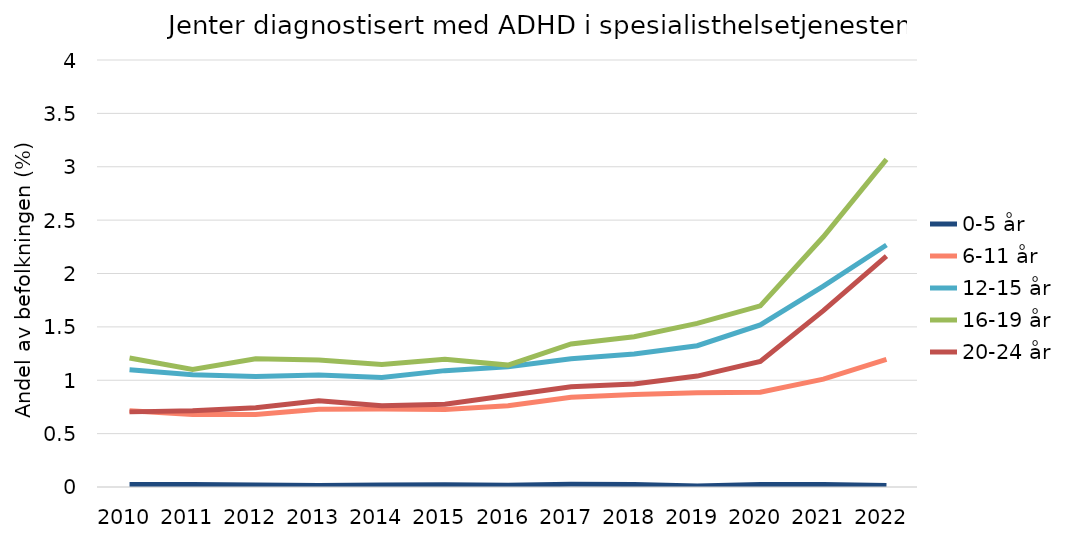
| Category | 0-5 år | 6-11 år | 12-15 år | 16-19 år | 20-24 år |
|---|---|---|---|---|---|
| 2010.0 | 0.024 | 0.713 | 1.099 | 1.208 | 0.704 |
| 2011.0 | 0.024 | 0.678 | 1.051 | 1.101 | 0.713 |
| 2012.0 | 0.02 | 0.678 | 1.036 | 1.201 | 0.743 |
| 2013.0 | 0.013 | 0.728 | 1.05 | 1.19 | 0.808 |
| 2014.0 | 0.019 | 0.73 | 1.026 | 1.147 | 0.76 |
| 2015.0 | 0.021 | 0.726 | 1.09 | 1.196 | 0.775 |
| 2016.0 | 0.017 | 0.76 | 1.127 | 1.142 | 0.858 |
| 2017.0 | 0.025 | 0.841 | 1.201 | 1.341 | 0.939 |
| 2018.0 | 0.023 | 0.866 | 1.247 | 1.408 | 0.965 |
| 2019.0 | 0.01 | 0.883 | 1.324 | 1.532 | 1.039 |
| 2020.0 | 0.024 | 0.889 | 1.519 | 1.697 | 1.175 |
| 2021.0 | 0.023 | 1.01 | 1.882 | 2.344 | 1.652 |
| 2022.0 | 0.013 | 1.195 | 2.267 | 3.068 | 2.163 |